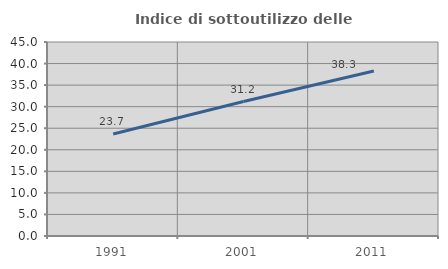
| Category | Indice di sottoutilizzo delle abitazioni  |
|---|---|
| 1991.0 | 23.676 |
| 2001.0 | 31.197 |
| 2011.0 | 38.272 |